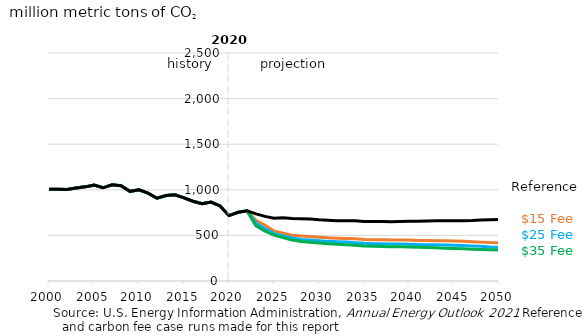
| Category | $15 Fee case | $25 Fee case | $35 Fee case | Reference |
|---|---|---|---|---|
| 2000.0 | 1004.976 | 1004.976 | 1004.976 | 1004.976 |
| 2001.0 | 1006.801 | 1006.801 | 1006.801 | 1006.801 |
| 2002.0 | 1002.328 | 1002.328 | 1002.328 | 1002.328 |
| 2003.0 | 1018.805 | 1018.805 | 1018.805 | 1018.805 |
| 2004.0 | 1032.314 | 1032.314 | 1032.314 | 1032.314 |
| 2005.0 | 1050.865 | 1050.865 | 1050.865 | 1050.865 |
| 2006.0 | 1021.935 | 1021.935 | 1021.935 | 1021.935 |
| 2007.0 | 1055.034 | 1055.034 | 1055.034 | 1055.034 |
| 2008.0 | 1045.551 | 1045.551 | 1045.551 | 1045.551 |
| 2009.0 | 983.507 | 983.507 | 983.507 | 983.507 |
| 2010.0 | 999.811 | 999.811 | 999.811 | 999.811 |
| 2011.0 | 963.349 | 963.349 | 963.349 | 963.349 |
| 2012.0 | 907.929 | 907.929 | 907.929 | 907.929 |
| 2013.0 | 937.583 | 937.583 | 937.583 | 937.583 |
| 2014.0 | 945.614 | 945.614 | 945.614 | 945.614 |
| 2015.0 | 910.847 | 910.847 | 910.847 | 910.847 |
| 2016.0 | 874.21 | 874.21 | 874.21 | 874.21 |
| 2017.0 | 846.334 | 846.334 | 846.334 | 846.334 |
| 2018.0 | 865.775 | 865.775 | 865.775 | 865.775 |
| 2019.0 | 822.662 | 822.662 | 822.662 | 822.662 |
| 2020.0 | 717.556 | 717.556 | 717.556 | 717.556 |
| 2021.0 | 752.384 | 752.54 | 752.74 | 753.285 |
| 2022.0 | 769.249 | 769.324 | 768.93 | 769.082 |
| 2023.0 | 663.58 | 630.328 | 603.956 | 736.358 |
| 2024.0 | 610.865 | 572.083 | 546.437 | 708.299 |
| 2025.0 | 548.882 | 519.667 | 504.035 | 688.931 |
| 2026.0 | 523.773 | 493.95 | 475.415 | 694.45 |
| 2027.0 | 502.598 | 471.019 | 450.409 | 684.76 |
| 2028.0 | 493.22 | 456.4 | 433.999 | 681.568 |
| 2029.0 | 488.63 | 449.302 | 424.214 | 679.986 |
| 2030.0 | 480.719 | 442.294 | 415.919 | 671.19 |
| 2031.0 | 473.175 | 434.509 | 408.751 | 666.053 |
| 2032.0 | 469.335 | 429.446 | 403.839 | 661.889 |
| 2033.0 | 466.492 | 426.367 | 398.218 | 660.939 |
| 2034.0 | 461.941 | 420.656 | 391.721 | 660.389 |
| 2035.0 | 455.602 | 412.766 | 383.564 | 653.035 |
| 2036.0 | 453.04 | 408.6 | 380.715 | 652.941 |
| 2037.0 | 452.265 | 407.48 | 379.652 | 652.18 |
| 2038.0 | 450.463 | 405.301 | 376.684 | 649.812 |
| 2039.0 | 450.361 | 404.951 | 375.012 | 651.225 |
| 2040.0 | 448.372 | 401.962 | 372.784 | 654.064 |
| 2041.0 | 444.909 | 399.539 | 369.771 | 654.526 |
| 2042.0 | 443.412 | 398.322 | 366.343 | 657.387 |
| 2043.0 | 441.507 | 397.171 | 364.223 | 659.288 |
| 2044.0 | 440.577 | 394.878 | 360.255 | 660.958 |
| 2045.0 | 438.739 | 392.304 | 357.122 | 660.44 |
| 2046.0 | 435.329 | 388.712 | 352.967 | 661.451 |
| 2047.0 | 431.623 | 384.285 | 349.424 | 663.395 |
| 2048.0 | 426.277 | 379.959 | 346.735 | 667.721 |
| 2049.0 | 421.287 | 373.2 | 343.59 | 671.87 |
| 2050.0 | 418.532 | 368.76 | 338.731 | 675.53 |